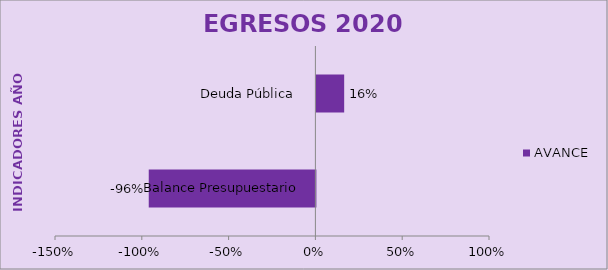
| Category | AVANCE |
|---|---|
| Balance Presupuestario | -0.96 |
| Deuda Pública  | 0.16 |